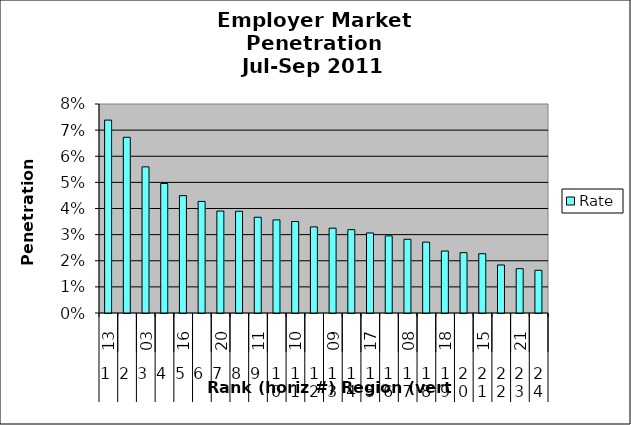
| Category | Rate |
|---|---|
| 0 | 0.074 |
| 1 | 0.067 |
| 2 | 0.056 |
| 3 | 0.05 |
| 4 | 0.045 |
| 5 | 0.043 |
| 6 | 0.039 |
| 7 | 0.039 |
| 8 | 0.037 |
| 9 | 0.036 |
| 10 | 0.035 |
| 11 | 0.033 |
| 12 | 0.032 |
| 13 | 0.032 |
| 14 | 0.031 |
| 15 | 0.03 |
| 16 | 0.028 |
| 17 | 0.027 |
| 18 | 0.024 |
| 19 | 0.023 |
| 20 | 0.023 |
| 21 | 0.018 |
| 22 | 0.017 |
| 23 | 0.016 |